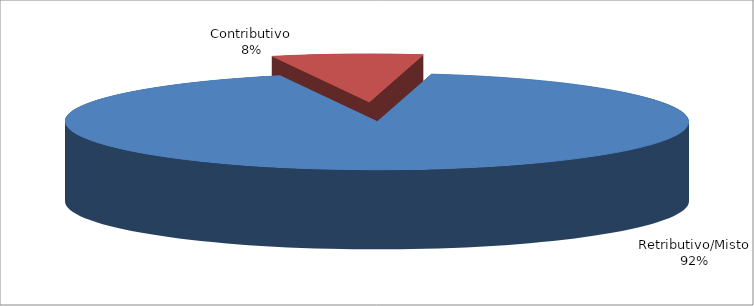
| Category | Series 1 |
|---|---|
| Retributivo/Misto | 355197 |
| Contributivo | 30119 |